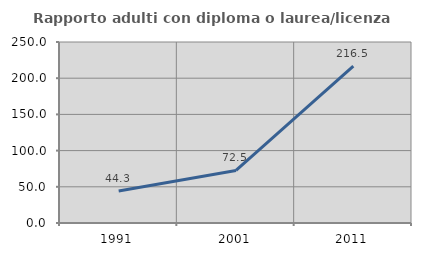
| Category | Rapporto adulti con diploma o laurea/licenza media  |
|---|---|
| 1991.0 | 44.322 |
| 2001.0 | 72.537 |
| 2011.0 | 216.525 |